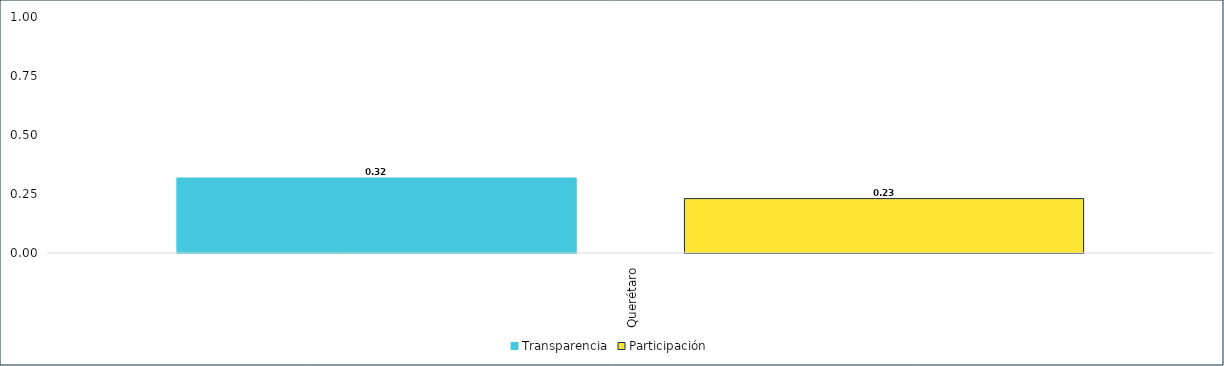
| Category | Transparencia | Participación |
|---|---|---|
| Querétaro | 0.318 | 0.231 |